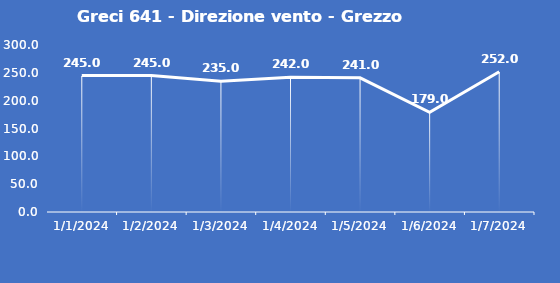
| Category | Greci 641 - Direzione vento - Grezzo (°N) |
|---|---|
| 1/1/24 | 245 |
| 1/2/24 | 245 |
| 1/3/24 | 235 |
| 1/4/24 | 242 |
| 1/5/24 | 241 |
| 1/6/24 | 179 |
| 1/7/24 | 252 |